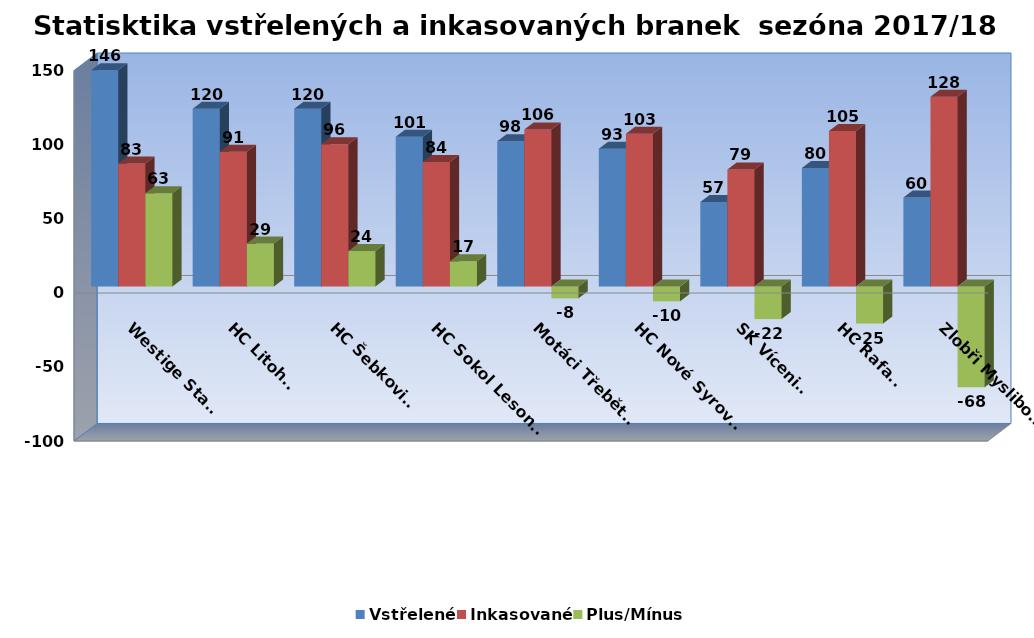
| Category | Vstřelené | Inkasované | Plus/Mínus |
|---|---|---|---|
| Westige Stařeč | 146 | 83 | 63 |
| HC Litohoř | 120 | 91 | 29 |
| HC Šebkovice | 120 | 96 | 24 |
| HC Sokol Lesonice | 101 | 84 | 17 |
| Motáci Třebětice | 98 | 106 | -8 |
| HC Nové Syrovice | 93 | 103 | -10 |
| SK Vícenice | 57 | 79 | -22 |
| HC Rafani | 80 | 105 | -25 |
| Zlobři Myslibořice | 60 | 128 | -68 |